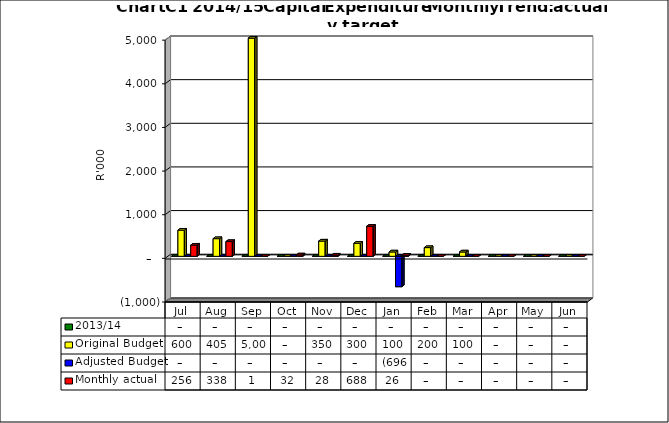
| Category | 2013/14 | Original Budget | Adjusted Budget | Monthly actual |
|---|---|---|---|---|
| Jul | 0 | 600000 | 0 | 256069.27 |
| Aug | 0 | 405000 | 0 | 338356.23 |
| Sep | 0 | 5000000 | 0 | 1400 |
| Oct | 0 | 0 | 0 | 31961 |
| Nov | 0 | 350000 | 0 | 27800 |
| Dec | 0 | 300000 | 0 | 688358.82 |
| Jan | 0 | 100000 | -696281 | 26000 |
| Feb | 0 | 200000 | 0 | 0 |
| Mar | 0 | 100000 | 0 | 0 |
| Apr | 0 | 0 | 0 | 0 |
| May | 0 | 0 | 0 | 0 |
| Jun | 0 | 0 | 0 | 0 |